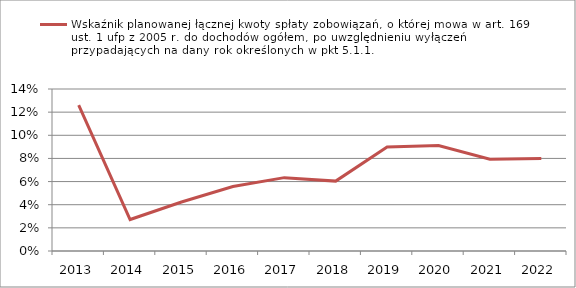
| Category | Wskaźnik planowanej łącznej kwoty spłaty zobowiązań, o której mowa w art. 169 ust. 1 ufp z 2005 r. do dochodów ogółem, po uwzględnieniu wyłączeń przypadających na dany rok określonych w pkt 5.1.1.  |
|---|---|
| 2013.0 | 0.126 |
| 2014.0 | 0.027 |
| 2015.0 | 0.042 |
| 2016.0 | 0.056 |
| 2017.0 | 0.063 |
| 2018.0 | 0.06 |
| 2019.0 | 0.09 |
| 2020.0 | 0.091 |
| 2021.0 | 0.079 |
| 2022.0 | 0.08 |